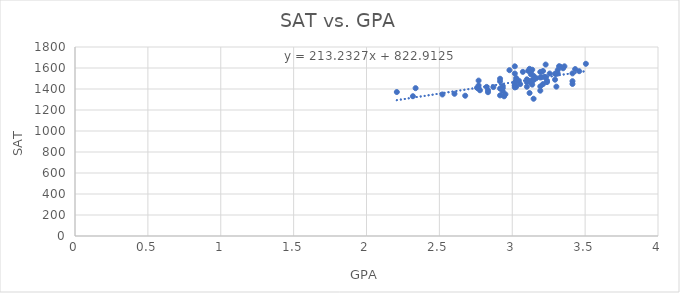
| Category | SAT vs. GPA |
|---|---|
| 2.208 | 1371.2 |
| 2.3184 | 1331.2 |
| 2.3368 | 1408 |
| 2.5208000000000004 | 1348 |
| 2.6036 | 1354.4 |
| 2.6772000000000005 | 1336 |
| 2.7600000000000002 | 1411.2 |
| 2.7600000000000002 | 1411.2 |
| 2.7692 | 1433.6 |
| 2.7692 | 1480 |
| 2.7784 | 1388 |
| 2.8244 | 1420 |
| 2.8336 | 1388 |
| 2.8336 | 1369.6 |
| 2.8704 | 1418.4 |
| 2.9164 | 1497.6 |
| 2.9164 | 1404 |
| 2.9164 | 1339.2 |
| 2.9164 | 1473.6 |
| 2.9348 | 1428.8 |
| 2.9348 | 1408.8 |
| 2.9348 | 1377.6 |
| 2.9440000000000004 | 1330.4 |
| 2.9532000000000003 | 1349.6 |
| 2.9808000000000003 | 1579.2 |
| 3.0176 | 1460.8 |
| 3.0176 | 1429.6 |
| 3.0176 | 1456.8 |
| 3.0176 | 1616 |
| 3.0176 | 1435.2 |
| 3.0176 | 1415.2 |
| 3.0176 | 1547.2 |
| 3.0268 | 1420 |
| 3.0268 | 1484 |
| 3.0268 | 1504 |
| 3.0452000000000004 | 1479.2 |
| 3.0544 | 1446.4 |
| 3.0728 | 1563.2 |
| 3.1004 | 1421.6 |
| 3.1004 | 1464.8 |
| 3.1004 | 1492 |
| 3.1096 | 1480 |
| 3.1096 | 1572.8 |
| 3.1188000000000002 | 1361.6 |
| 3.1188000000000002 | 1592 |
| 3.128 | 1540 |
| 3.128 | 1459.2 |
| 3.128 | 1564.8 |
| 3.1372000000000004 | 1485.6 |
| 3.1372000000000004 | 1583.2 |
| 3.1372000000000004 | 1441.6 |
| 3.1464 | 1484 |
| 3.1464 | 1525.6 |
| 3.1464 | 1307.2 |
| 3.1648 | 1503.2 |
| 3.1924 | 1509.6 |
| 3.1924 | 1384 |
| 3.1924 | 1562.4 |
| 3.1924 | 1424.8 |
| 3.2016 | 1512.8 |
| 3.2108000000000003 | 1571.2 |
| 3.2108000000000003 | 1446.4 |
| 3.22 | 1514.4 |
| 3.2292 | 1632.8 |
| 3.2292 | 1514.4 |
| 3.2384 | 1465.6 |
| 3.2384 | 1480 |
| 3.2568 | 1547.2 |
| 3.2936 | 1488.8 |
| 3.2936 | 1544.8 |
| 3.3028 | 1546.4 |
| 3.3028 | 1422.4 |
| 3.3120000000000003 | 1580 |
| 3.3120000000000003 | 1547.2 |
| 3.3212 | 1616.8 |
| 3.3304 | 1612 |
| 3.3488 | 1597.6 |
| 3.358 | 1616 |
| 3.4132000000000002 | 1474.4 |
| 3.4132000000000002 | 1548.8 |
| 3.4132000000000002 | 1448 |
| 3.4316 | 1589.6 |
| 3.4592 | 1569.6 |
| 3.5052000000000003 | 1640 |